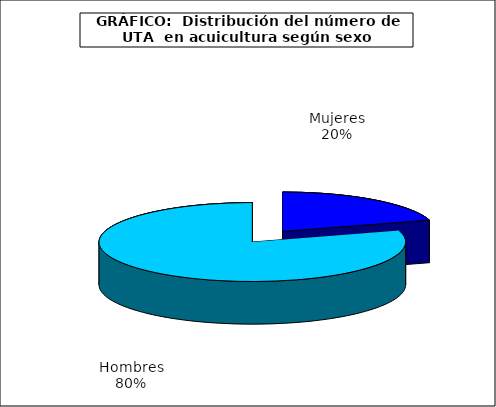
| Category | UTA | Series 1 |
|---|---|---|
| 0 | 1162.942 |  |
| 1 | 4558.801 |  |